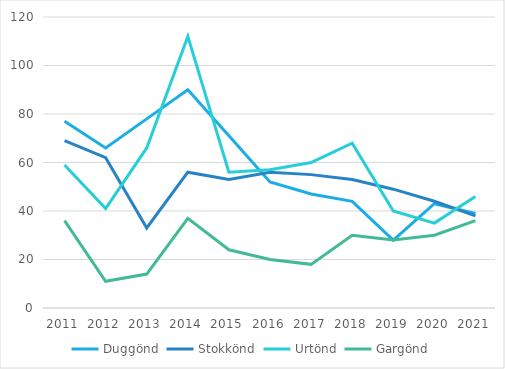
| Category | Duggönd | Stokkönd | Urtönd | Gargönd |
|---|---|---|---|---|
| 2011.0 | 77 | 69 | 59 | 36 |
| 2012.0 | 66 | 62 | 41 | 11 |
| 2013.0 | 78 | 33 | 66 | 14 |
| 2014.0 | 90 | 56 | 112 | 37 |
| 2015.0 | 71 | 53 | 56 | 24 |
| 2016.0 | 52 | 56 | 57 | 20 |
| 2017.0 | 47 | 55 | 60 | 18 |
| 2018.0 | 44 | 53 | 68 | 30 |
| 2019.0 | 28 | 49 | 40 | 28 |
| 2020.0 | 43 | 44 | 35 | 30 |
| 2021.0 | 39 | 38 | 46 | 36 |